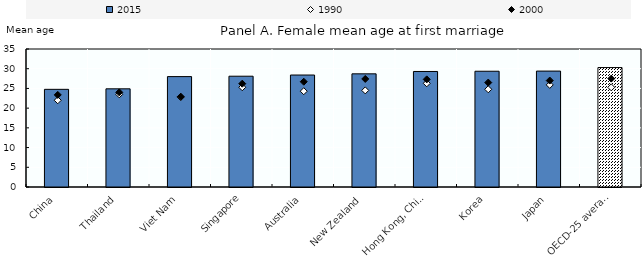
| Category | 2015 |
|---|---|
| China | 24.77 |
| Thailand | 24.9 |
| Viet Nam | 28 |
| Singapore | 28.1 |
| Australia | 28.4 |
| New Zealand | 28.7 |
| Hong Kong, China | 29.3 |
| Korea | 29.36 |
| Japan | 29.4 |
| OECD-25 average (e) | 30.292 |